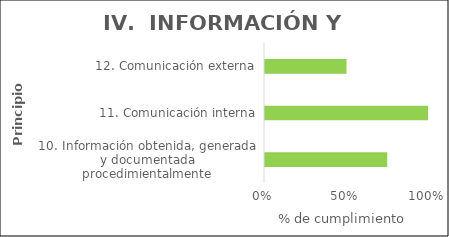
| Category | Principios |
|---|---|
| 10. Información obtenida, generada y documentada procedimientalmente | 0.75 |
| 11. Comunicación interna | 1 |
| 12. Comunicación externa | 0.5 |